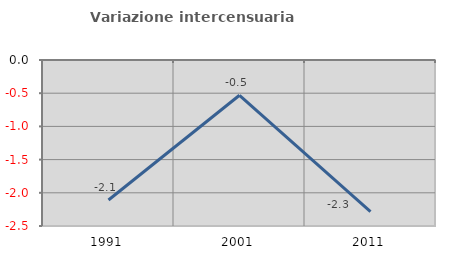
| Category | Variazione intercensuaria annua |
|---|---|
| 1991.0 | -2.109 |
| 2001.0 | -0.531 |
| 2011.0 | -2.284 |